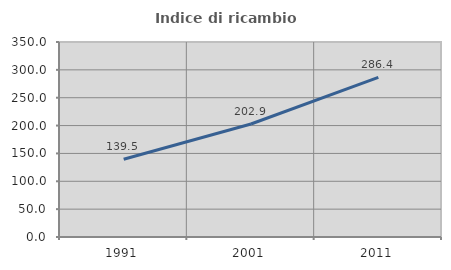
| Category | Indice di ricambio occupazionale  |
|---|---|
| 1991.0 | 139.506 |
| 2001.0 | 202.857 |
| 2011.0 | 286.364 |